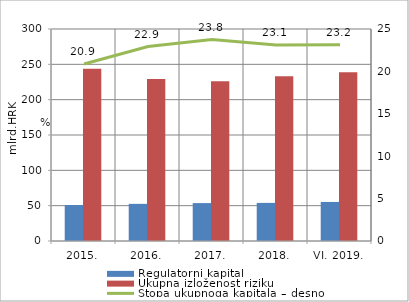
| Category | Regulatorni kapital | Ukupna izloženost riziku |
|---|---|---|
| 2015. | 50.917 | 243.83 |
| 2016. | 52.569 | 229.272 |
| 2017. | 53.638 | 225.885 |
| 2018. | 53.914 | 233.22 |
| VI. 2019. | 55.269 | 238.765 |